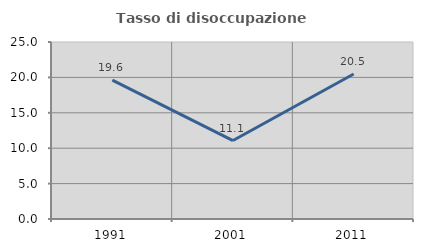
| Category | Tasso di disoccupazione giovanile  |
|---|---|
| 1991.0 | 19.626 |
| 2001.0 | 11.082 |
| 2011.0 | 20.486 |